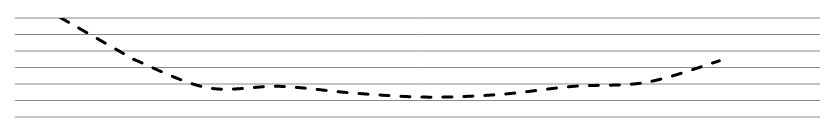
| Category | Series 0 |
|---|---|
| 727.2727272727273 | 417.434 |
| 1090.909090909091 | 536.153 |
| 1454.5454545454545 | 616.576 |
| 1818.1818181818182 | 612.747 |
| 2181.818181818182 | 631.895 |
| 2545.4545454545455 | 643.384 |
| 2909.090909090909 | 635.725 |
| 3272.727272727273 | 612.747 |
| 3636.3636363636365 | 601.258 |
| 4000.0 | 539.983 |